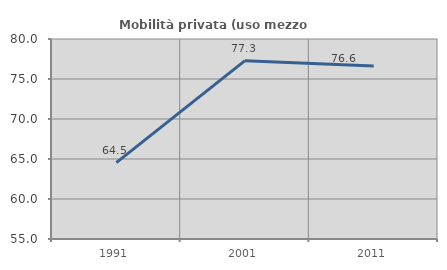
| Category | Mobilità privata (uso mezzo privato) |
|---|---|
| 1991.0 | 64.539 |
| 2001.0 | 77.293 |
| 2011.0 | 76.639 |